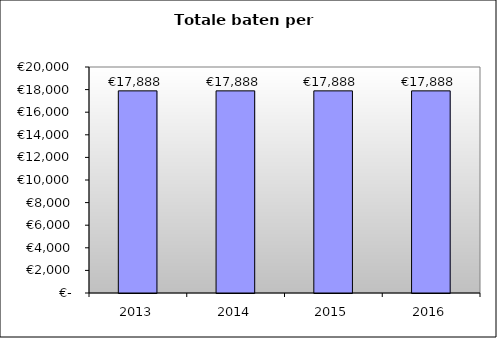
| Category | Series 0 |
|---|---|
| 2013.0 | 17888.489 |
| 2014.0 | 17888.489 |
| 2015.0 | 17888.489 |
| 2016.0 | 17888.489 |